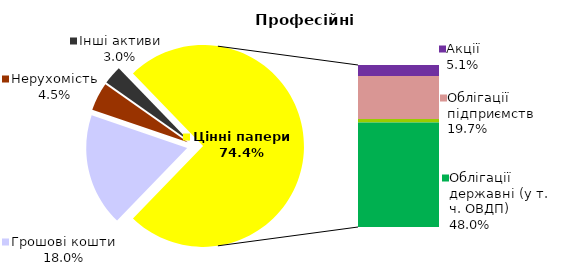
| Category | Професійні |
|---|---|
| Грошові кошти | 27.808 |
| Банківські метали | 0 |
| Нерухомість | 7.006 |
| Інші активи | 4.638 |
| Акції | 7.887 |
| Облігації підприємств | 30.48 |
| Муніципальні облігації | 2.407 |
| Облігації державні (у т. ч. ОВДП) | 74.102 |